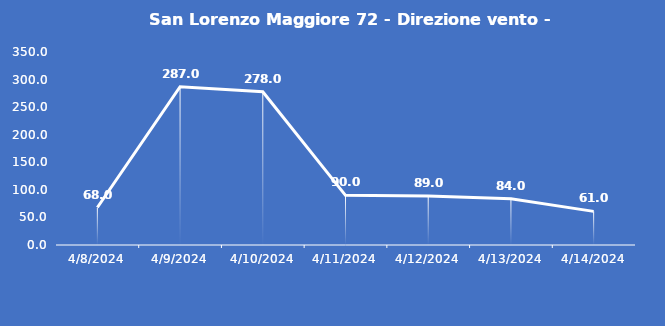
| Category | San Lorenzo Maggiore 72 - Direzione vento - Grezzo (°N) |
|---|---|
| 4/8/24 | 68 |
| 4/9/24 | 287 |
| 4/10/24 | 278 |
| 4/11/24 | 90 |
| 4/12/24 | 89 |
| 4/13/24 | 84 |
| 4/14/24 | 61 |